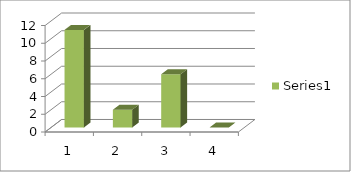
| Category | Series 0 |
|---|---|
| 0 | 11 |
| 1 | 2 |
| 2 | 6 |
| 3 | 0 |